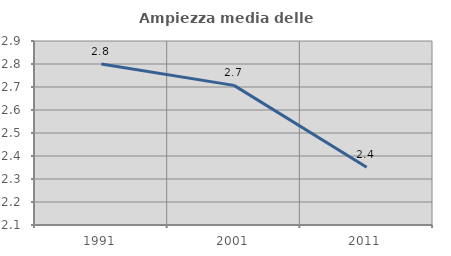
| Category | Ampiezza media delle famiglie |
|---|---|
| 1991.0 | 2.8 |
| 2001.0 | 2.707 |
| 2011.0 | 2.351 |